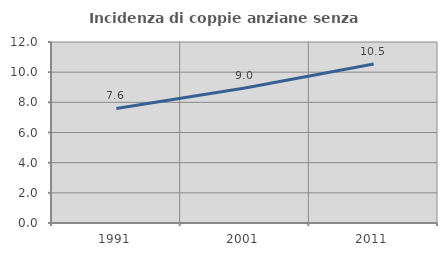
| Category | Incidenza di coppie anziane senza figli  |
|---|---|
| 1991.0 | 7.595 |
| 2001.0 | 8.951 |
| 2011.0 | 10.548 |